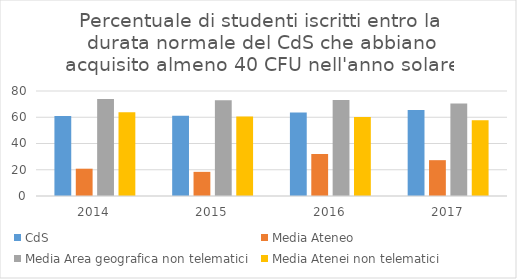
| Category | CdS | Media Ateneo | Media Area geografica non telematici | Media Atenei non telematici |
|---|---|---|---|---|
| 2014.0 | 60.9 | 20.8 | 73.9 | 63.8 |
| 2015.0 | 61.1 | 18.4 | 72.9 | 60.5 |
| 2016.0 | 63.6 | 32 | 73.1 | 60.1 |
| 2017.0 | 65.6 | 27.3 | 70.5 | 57.8 |